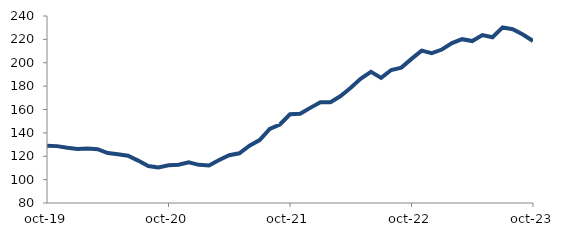
| Category | Series 0 |
|---|---|
| 2019-10-01 | 129.013 |
| 2019-11-01 | 128.663 |
| 2019-12-01 | 127.192 |
| 2020-01-01 | 126.144 |
| 2020-02-01 | 126.638 |
| 2020-03-01 | 125.992 |
| 2020-04-01 | 122.726 |
| 2020-05-01 | 121.669 |
| 2020-06-01 | 120.485 |
| 2020-07-01 | 116.268 |
| 2020-08-01 | 111.597 |
| 2020-09-01 | 110.39 |
| 2020-10-01 | 112.229 |
| 2020-11-01 | 112.769 |
| 2020-12-01 | 114.741 |
| 2021-01-01 | 112.625 |
| 2021-02-01 | 112.14 |
| 2021-03-01 | 116.74 |
| 2021-04-01 | 120.911 |
| 2021-05-01 | 122.536 |
| 2021-06-01 | 128.968 |
| 2021-07-01 | 133.864 |
| 2021-08-01 | 143.384 |
| 2021-09-01 | 147.196 |
| 2021-10-01 | 155.883 |
| 2021-11-01 | 156.426 |
| 2021-12-01 | 161.4 |
| 2022-01-01 | 166.276 |
| 2022-02-01 | 166.219 |
| 2022-03-01 | 171.531 |
| 2022-04-01 | 178.644 |
| 2022-05-01 | 186.465 |
| 2022-06-01 | 192.187 |
| 2022-07-01 | 187.044 |
| 2022-08-01 | 193.806 |
| 2022-09-01 | 195.846 |
| 2022-10-01 | 203.287 |
| 2022-11-01 | 210.344 |
| 2022-12-01 | 208.16 |
| 2023-01-01 | 211.29 |
| 2023-02-01 | 216.772 |
| 2023-03-01 | 220.156 |
| 2023-04-01 | 218.537 |
| 2023-05-01 | 223.702 |
| 2023-06-01 | 221.798 |
| 2023-07-01 | 230.236 |
| 2023-08-01 | 228.637 |
| 2023-09-01 | 224.175 |
| 2023-10-01 | 218.647 |